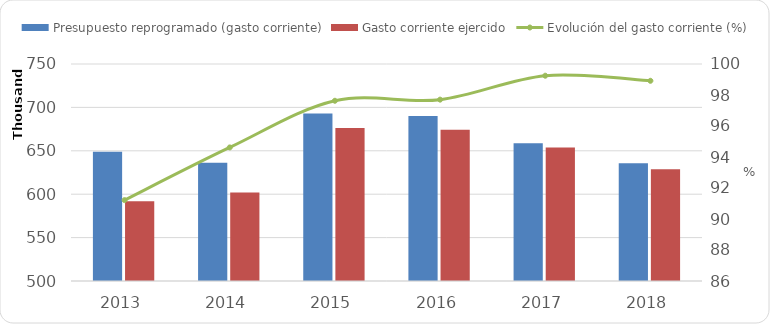
| Category | Presupuesto reprogramado (gasto corriente) | Gasto corriente ejercido |
|---|---|---|
| 2013 | 648900.7 | 591915.7 |
| 2014 | 636228.2 | 601977.4 |
| 2015 | 692840.462 | 676403.338 |
| 2016 | 690154.161 | 674285.7 |
| 2017 | 658646.191 | 653670.792 |
| 2018 | 635662.96 | 628777.639 |